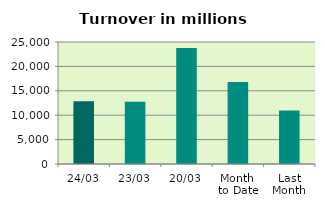
| Category | Series 0 |
|---|---|
| 24/03 | 12857.054 |
| 23/03 | 12750.39 |
| 20/03 | 23777.819 |
| Month 
to Date | 16784.237 |
| Last
Month | 10948.033 |